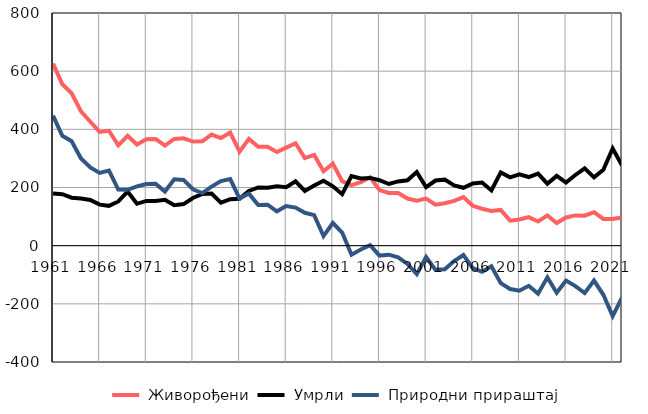
| Category |  Живорођени |  Умрли |  Природни прираштај |
|---|---|---|---|
| 1961.0 | 626 | 179 | 447 |
| 1962.0 | 555 | 177 | 378 |
| 1963.0 | 524 | 165 | 359 |
| 1964.0 | 462 | 162 | 300 |
| 1965.0 | 426 | 157 | 269 |
| 1966.0 | 391 | 141 | 250 |
| 1967.0 | 395 | 137 | 258 |
| 1968.0 | 345 | 152 | 193 |
| 1969.0 | 378 | 186 | 192 |
| 1970.0 | 348 | 144 | 204 |
| 1971.0 | 366 | 154 | 212 |
| 1972.0 | 367 | 154 | 213 |
| 1973.0 | 344 | 158 | 186 |
| 1974.0 | 367 | 139 | 228 |
| 1975.0 | 369 | 143 | 226 |
| 1976.0 | 358 | 164 | 194 |
| 1977.0 | 359 | 178 | 181 |
| 1978.0 | 382 | 179 | 203 |
| 1979.0 | 370 | 148 | 222 |
| 1980.0 | 389 | 160 | 229 |
| 1981.0 | 323 | 161 | 162 |
| 1982.0 | 367 | 188 | 179 |
| 1983.0 | 340 | 200 | 140 |
| 1984.0 | 340 | 199 | 141 |
| 1985.0 | 322 | 204 | 118 |
| 1986.0 | 337 | 201 | 136 |
| 1987.0 | 352 | 221 | 131 |
| 1988.0 | 301 | 188 | 113 |
| 1989.0 | 312 | 207 | 105 |
| 1990.0 | 256 | 223 | 33 |
| 1991.0 | 282 | 204 | 78 |
| 1992.0 | 222 | 177 | 45 |
| 1993.0 | 208 | 239 | -31 |
| 1994.0 | 218 | 231 | -13 |
| 1995.0 | 235 | 233 | 2 |
| 1996.0 | 191 | 225 | -34 |
| 1997.0 | 181 | 212 | -31 |
| 1998.0 | 181 | 221 | -40 |
| 1999.0 | 162 | 225 | -63 |
| 2000.0 | 155 | 253 | -98 |
| 2001.0 | 162 | 201 | -39 |
| 2002.0 | 141 | 224 | -83 |
| 2003.0 | 146 | 227 | -81 |
| 2004.0 | 154 | 207 | -53 |
| 2005.0 | 167 | 199 | -32 |
| 2006.0 | 137 | 214 | -77 |
| 2007.0 | 127 | 217 | -90 |
| 2008.0 | 119 | 190 | -71 |
| 2009.0 | 123 | 252 | -129 |
| 2010.0 | 86 | 235 | -149 |
| 2011.0 | 90 | 245 | -155 |
| 2012.0 | 98 | 236 | -138 |
| 2013.0 | 83 | 248 | -165 |
| 2014.0 | 104 | 213 | -109 |
| 2015.0 | 78 | 240 | -162 |
| 2016.0 | 97 | 217 | -120 |
| 2017.0 | 104 | 243 | -139 |
| 2018.0 | 103 | 266 | -163 |
| 2019.0 | 115 | 235 | -120 |
| 2020.0 | 92 | 261 | -169 |
| 2021.0 | 92 | 334 | -242 |
| 2022.0 | 97 | 276 | -179 |